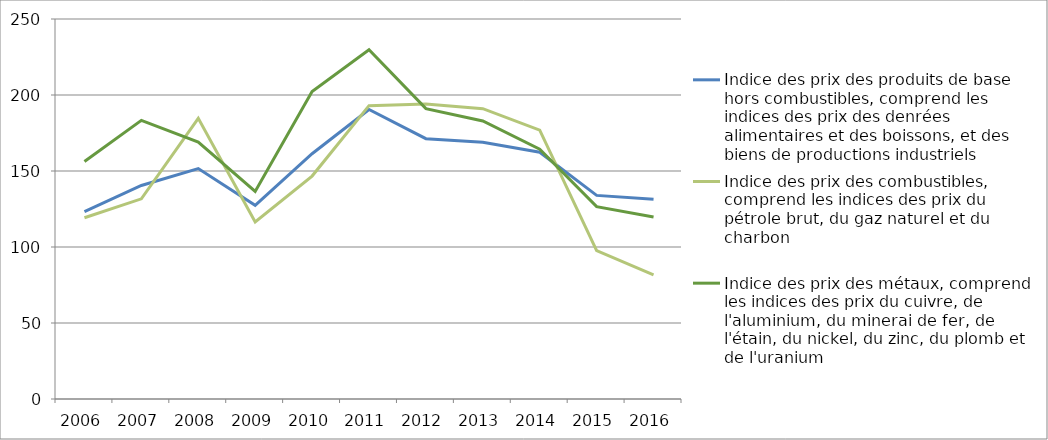
| Category | Indice des prix des produits de base hors combustibles, comprend les indices des prix des denrées alimentaires et des boissons, et des biens de productions industriels | Indice des prix des combustibles, comprend les indices des prix du pétrole brut, du gaz naturel et du charbon | Indice des prix des métaux, comprend les indices des prix du cuivre, de l'aluminium, du minerai de fer, de l'étain, du nickel, du zinc, du plomb et de l'uranium |
|---|---|---|---|
| 2006.0 | 123.258 | 119.256 | 156.196 |
| 2007.0 | 140.485 | 131.686 | 183.312 |
| 2008.0 | 151.62 | 184.637 | 169.013 |
| 2009.0 | 127.429 | 116.457 | 136.53 |
| 2010.0 | 161.376 | 146.669 | 202.32 |
| 2011.0 | 190.472 | 192.98 | 229.719 |
| 2012.0 | 171.245 | 194.152 | 191.034 |
| 2013.0 | 168.908 | 191.001 | 182.902 |
| 2014.0 | 162.327 | 176.918 | 164.375 |
| 2015.0 | 133.951 | 97.655 | 126.574 |
| 2016.0 | 131.48 | 81.582 | 119.73 |